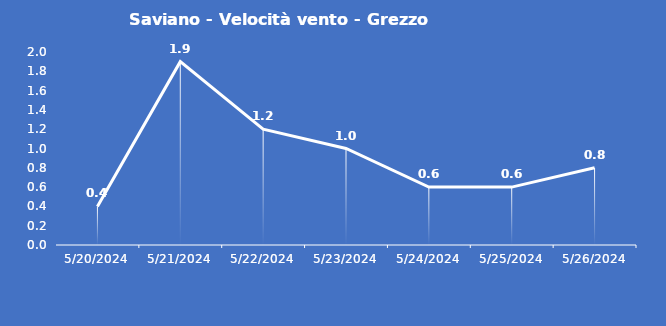
| Category | Saviano - Velocità vento - Grezzo (m/s) |
|---|---|
| 5/20/24 | 0.4 |
| 5/21/24 | 1.9 |
| 5/22/24 | 1.2 |
| 5/23/24 | 1 |
| 5/24/24 | 0.6 |
| 5/25/24 | 0.6 |
| 5/26/24 | 0.8 |